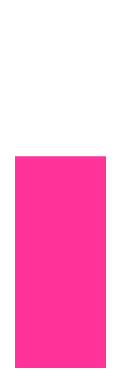
| Category | Women |
|---|---|
| 0 | 0.6 |